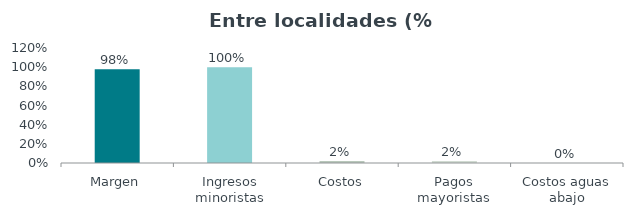
| Category | Series 0 |
|---|---|
| Margen | 0.979 |
| Ingresos minoristas | 1 |
| Costos | 0.021 |
| Pagos mayoristas | 0.021 |
| Costos aguas abajo | 0 |